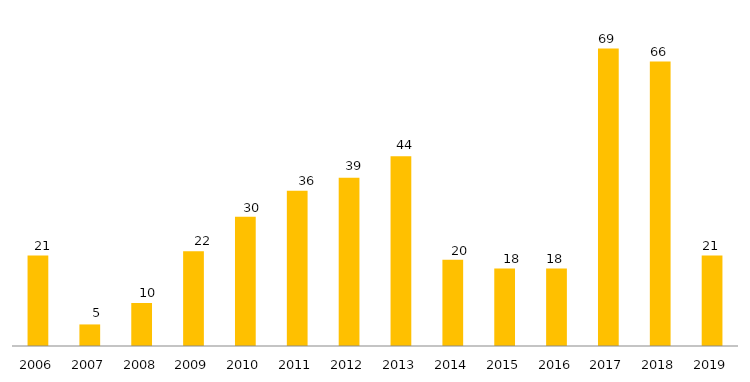
| Category | Concluídos*** |
|---|---|
| 2006.0 | 21 |
| 2007.0 | 5 |
| 2008.0 | 10 |
| 2009.0 | 22 |
| 2010.0 | 30 |
| 2011.0 | 36 |
| 2012.0 | 39 |
| 2013.0 | 44 |
| 2014.0 | 20 |
| 2015.0 | 18 |
| 2016.0 | 18 |
| 2017.0 | 69 |
| 2018.0 | 66 |
| 2019.0 | 21 |